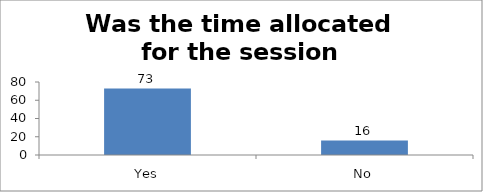
| Category | Was the time allocated for the session sufficient? |
|---|---|
| Yes | 73 |
| No | 16 |